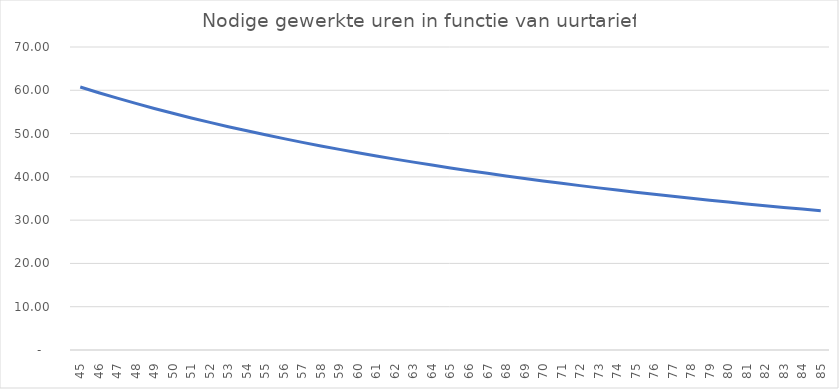
| Category | Series 0 |
|---|---|
| 45.0 | 60.761 |
| 46.0 | 59.441 |
| 47.0 | 58.176 |
| 48.0 | 56.964 |
| 49.0 | 55.801 |
| 50.0 | 54.685 |
| 51.0 | 53.613 |
| 52.0 | 52.582 |
| 53.0 | 51.59 |
| 54.0 | 50.635 |
| 55.0 | 49.714 |
| 56.0 | 48.826 |
| 57.0 | 47.97 |
| 58.0 | 47.142 |
| 59.0 | 46.343 |
| 60.0 | 45.571 |
| 61.0 | 44.824 |
| 62.0 | 44.101 |
| 63.0 | 43.401 |
| 64.0 | 42.723 |
| 65.0 | 42.066 |
| 66.0 | 41.428 |
| 67.0 | 40.81 |
| 68.0 | 40.21 |
| 69.0 | 39.627 |
| 70.0 | 39.061 |
| 71.0 | 38.511 |
| 72.0 | 37.976 |
| 73.0 | 37.456 |
| 74.0 | 36.95 |
| 75.0 | 36.457 |
| 76.0 | 35.977 |
| 77.0 | 35.51 |
| 78.0 | 35.055 |
| 79.0 | 34.611 |
| 80.0 | 34.178 |
| 81.0 | 33.756 |
| 82.0 | 33.345 |
| 83.0 | 32.943 |
| 84.0 | 32.551 |
| 85.0 | 32.168 |